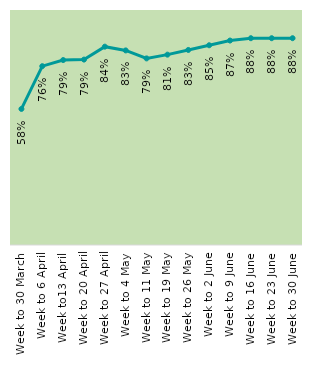
| Category | Series 0 |
|---|---|
| Week to 30 March | 0.579 |
| Week to 6 April | 0.761 |
| Week to13 April | 0.787 |
| Week to 20 April | 0.789 |
| Week to 27 April | 0.844 |
| Week to 4 May | 0.828 |
| Week to 11 May | 0.794 |
| Week to 19 May | 0.81 |
| Week to 26 May | 0.83 |
| Week to 2 June | 0.85 |
| Week to 9 June | 0.87 |
| Week to 16 June | 0.88 |
| Week to 23 June | 0.88 |
| Week to 30 June | 0.88 |